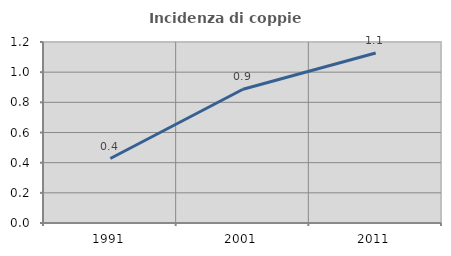
| Category | Incidenza di coppie miste |
|---|---|
| 1991.0 | 0.427 |
| 2001.0 | 0.887 |
| 2011.0 | 1.127 |